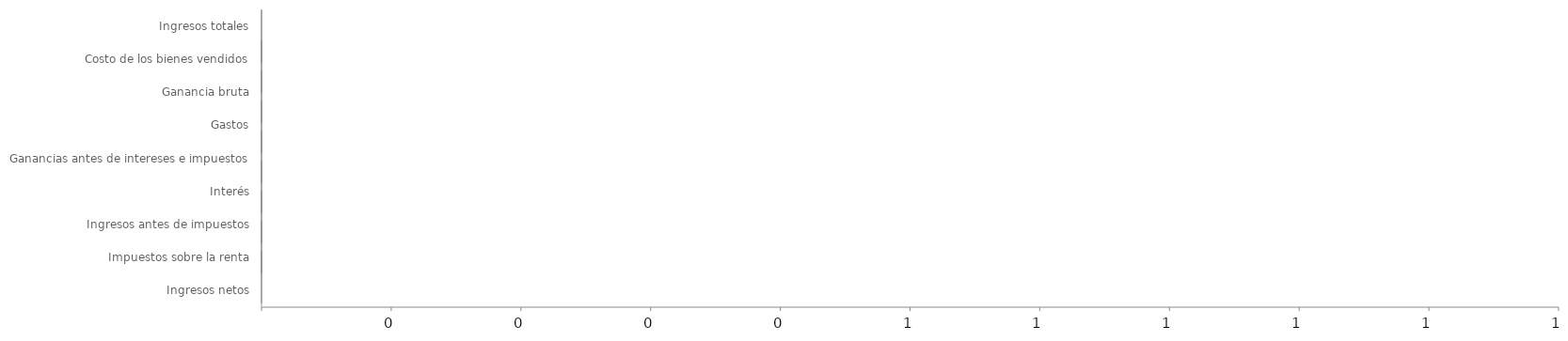
| Category | Extremos | Blanco | Pérdida negativa | Ganancia negativa | Pérdida positiva | Ganancia positiva |
|---|---|---|---|---|---|---|
| Ingresos totales | 0 | 0 | 0 | 0 | 0 | 0 |
| Costo de los bienes vendidos | 0 | 0 | 0 | 0 | 0 | 0 |
| Ganancia bruta | 0 | 0 | 0 | 0 | 0 | 0 |
| Gastos | 0 | 0 | 0 | 0 | 0 | 0 |
| Ganancias antes de intereses e impuestos | 0 | 0 | 0 | 0 | 0 | 0 |
| Interés | 0 | 0 | 0 | 0 | 0 | 0 |
| Ingresos antes de impuestos | 0 | 0 | 0 | 0 | 0 | 0 |
| Impuestos sobre la renta | 0 | 0 | 0 | 0 | 0 | 0 |
| Ingresos netos | 0 | 0 | 0 | 0 | 0 | 0 |